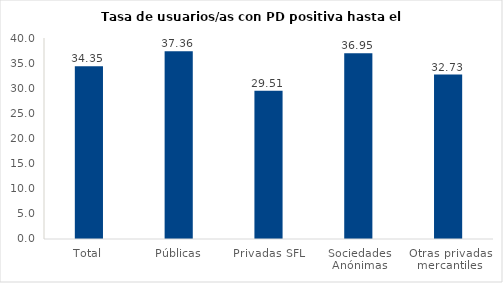
| Category | Series 0 |
|---|---|
| Total | 34.355 |
| Públicas | 37.361 |
| Privadas SFL | 29.514 |
| Sociedades Anónimas | 36.954 |
| Otras privadas mercantiles | 32.732 |